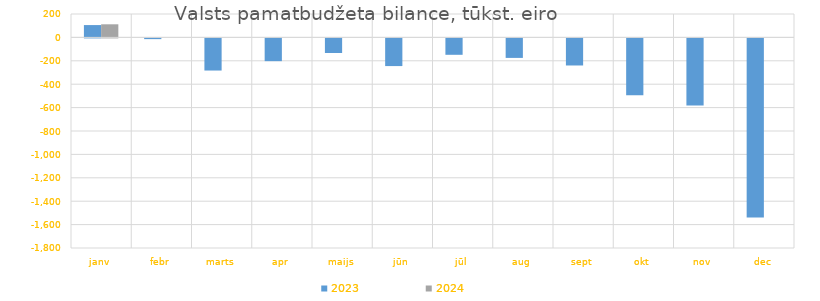
| Category | 2023 | 2024 |
|---|---|---|
| janv | 105353.718 | 111979.605 |
| febr | -6220.179 | 0 |
| marts | -274666.553 | 0 |
| apr | -194503.718 | 0 |
| maijs | -124781.003 | 0 |
| jūn | -236599.834 | 0 |
| jūl | -140162.257 | 0 |
| aug | -166723.666 | 0 |
| sept | -231453.563 | 0 |
| okt | -484910.74 | 0 |
| nov | -572440.257 | 0 |
| dec | -1531000.702 | 0 |